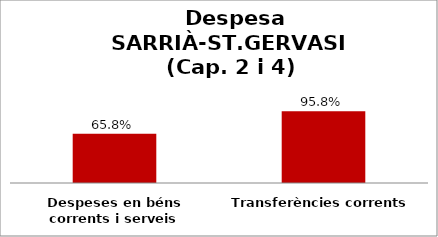
| Category | Series 0 |
|---|---|
| Despeses en béns corrents i serveis | 0.658 |
| Transferències corrents | 0.958 |